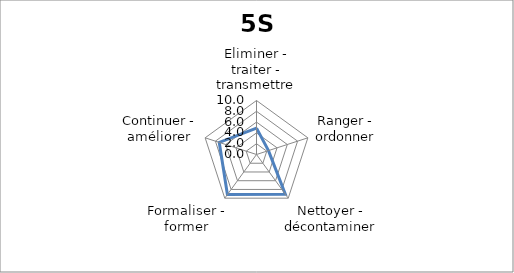
| Category | Series 0 |
|---|---|
| Eliminer - traiter - transmettre | 4.889 |
| Ranger - ordonner | 2.333 |
| Nettoyer - décontaminer | 9.091 |
| Formaliser - former | 9.167 |
| Continuer - améliorer | 7.25 |